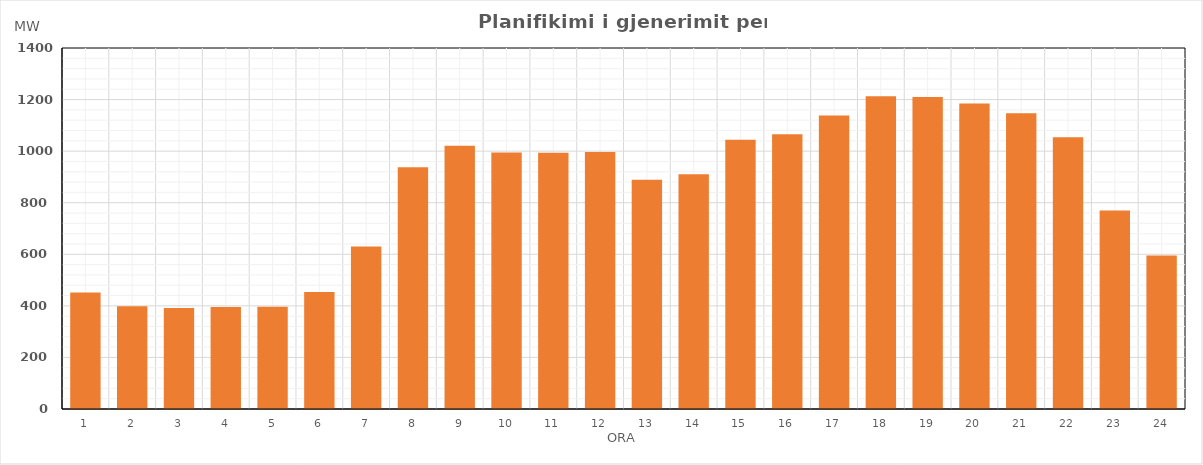
| Category | Max (MW) |
|---|---|
| 0 | 451.4 |
| 1 | 398 |
| 2 | 392 |
| 3 | 395.5 |
| 4 | 396.8 |
| 5 | 454.22 |
| 6 | 630.17 |
| 7 | 937.32 |
| 8 | 1021.05 |
| 9 | 995.03 |
| 10 | 994.03 |
| 11 | 996.29 |
| 12 | 889.26 |
| 13 | 910.22 |
| 14 | 1044.44 |
| 15 | 1065.77 |
| 16 | 1138.62 |
| 17 | 1212.44 |
| 18 | 1210.28 |
| 19 | 1184.82 |
| 20 | 1147.19 |
| 21 | 1054.16 |
| 22 | 769.33 |
| 23 | 595.37 |